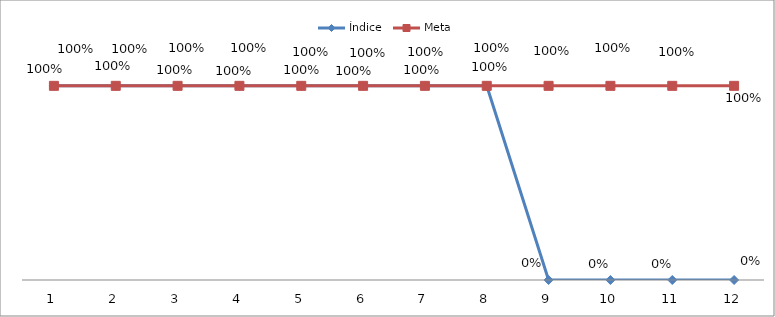
| Category | Índice | Meta |
|---|---|---|
| 0 | 1 | 1 |
| 1 | 1 | 1 |
| 2 | 1 | 1 |
| 3 | 1 | 1 |
| 4 | 1 | 1 |
| 5 | 1 | 1 |
| 6 | 1 | 1 |
| 7 | 1 | 1 |
| 8 | 0 | 1 |
| 9 | 0 | 1 |
| 10 | 0 | 1 |
| 11 | 0 | 1 |